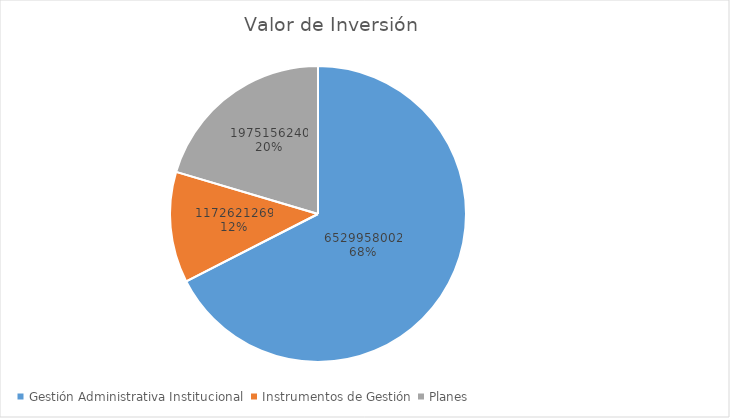
| Category | Valor de Inversión | Porcentaje de Ejecución |
|---|---|---|
| Gestión Administrativa Institucional | 6529958002 | 22 |
| Instrumentos de Gestión | 1172621269 | 12 |
| Planes | 1975156240 | 13 |